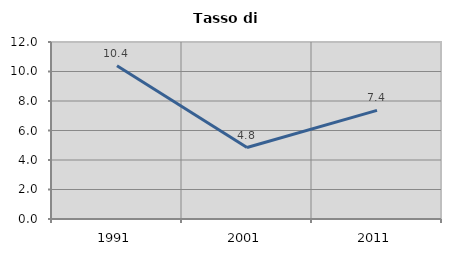
| Category | Tasso di disoccupazione   |
|---|---|
| 1991.0 | 10.393 |
| 2001.0 | 4.846 |
| 2011.0 | 7.365 |